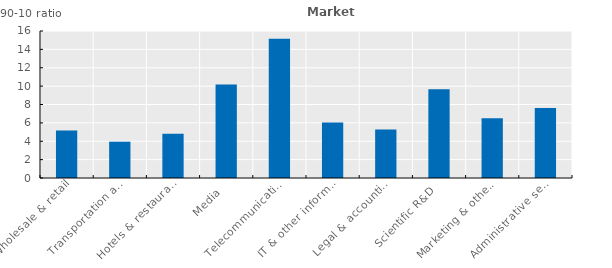
| Category | Series 0 |
|---|---|
| Wholesale & retail | 5.167 |
| Transportation and storage | 3.953 |
| Hotels & restaurants | 4.821 |
| Media  | 10.179 |
| Telecommunications  | 15.168 |
| IT & other information serv. | 6.03 |
| Legal & accounting | 5.275 |
| Scientific R&D  | 9.664 |
| Marketing & other  | 6.509 |
| Administrative services  | 7.617 |